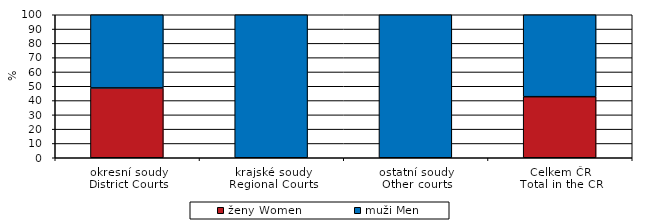
| Category | ženy Women | muži Men |
|---|---|---|
| okresní soudy
District Courts | 48.81 | 51.19 |
| krajské soudy
Regional Courts | 0 | 100 |
| ostatní soudy
Other courts | 0 | 100 |
| Celkem ČR
Total in the CR | 42.708 | 57.292 |